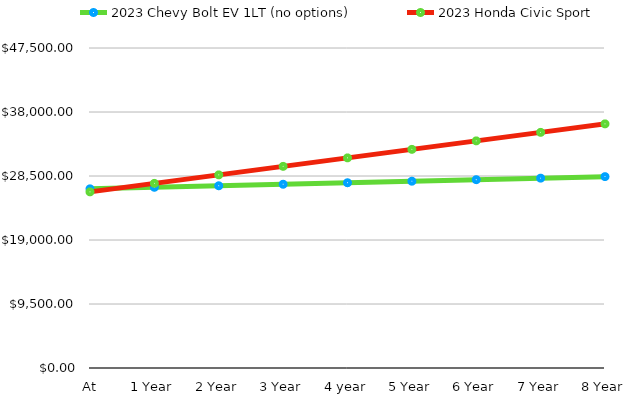
| Category | 2023 Chevy Bolt EV 1LT (no options) | 2023 Honda Civic Sport |
|---|---|---|
| At Purchase | 26595 | 26145 |
| 1 Year | 26821.397 | 27406.844 |
| 2 Year | 27047.794 | 28668.687 |
| 3 Year | 27274.19 | 29930.531 |
| 4 year | 27500.587 | 31192.375 |
| 5 Year | 27726.984 | 32454.218 |
| 6 Year | 27953.381 | 33716.062 |
| 7 Year | 28179.778 | 34977.905 |
| 8 Year | 28406.174 | 36239.749 |